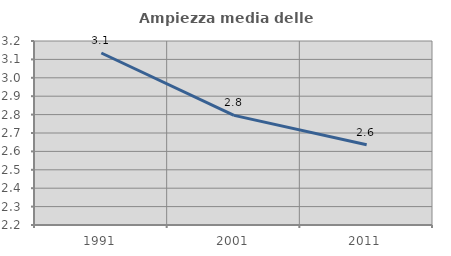
| Category | Ampiezza media delle famiglie |
|---|---|
| 1991.0 | 3.135 |
| 2001.0 | 2.796 |
| 2011.0 | 2.636 |